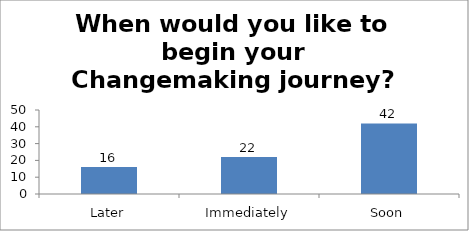
| Category | When would you like to begin your Changemaking journey?  |
|---|---|
| Later | 16 |
| Immediately | 22 |
| Soon | 42 |